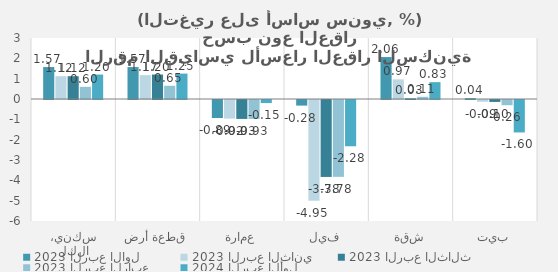
| Category | 2023 | 2024 |
|---|---|---|
| سكني، الكل | 0.599 | 1.202 |
| قطعة أرض | 0.651 | 1.25 |
| عمارة | -0.931 | -0.151 |
| فيلا | -3.78 | -2.275 |
| شقة | 0.107 | 0.829 |
| بيت | -0.256 | -1.596 |